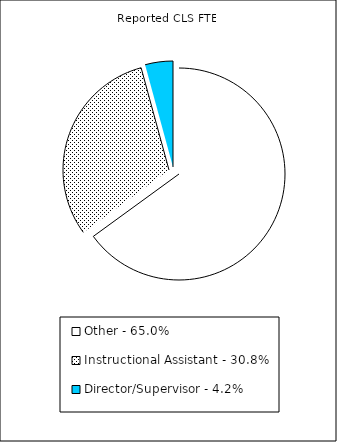
| Category | Reported FTE |
|---|---|
| Other - 65.0% | 28618.8 |
| Instructional Assistant - 30.8% | 13553.23 |
| Director/Supervisor - 4.2% | 1866.88 |